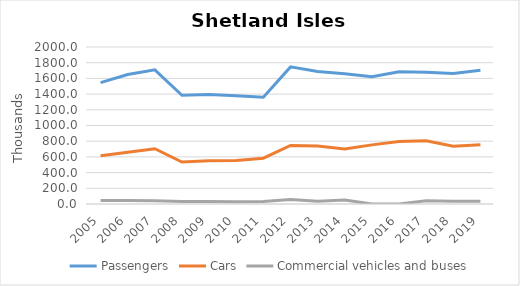
| Category | Passengers | Cars | Commercial vehicles and buses |
|---|---|---|---|
| 2005.0 | 1546.723 | 614.5 | 44.8 |
| 2006.0 | 1649.078 | 660.424 | 43.61 |
| 2007.0 | 1708.572 | 703.868 | 41.382 |
| 2008.0 | 1384.764 | 534.804 | 31.112 |
| 2009.0 | 1393.5 | 550.2 | 31.2 |
| 2010.0 | 1377.8 | 555.4 | 30 |
| 2011.0 | 1359.1 | 583.6 | 30.76 |
| 2012.0 | 1746.6 | 746.2 | 57 |
| 2013.0 | 1687.307 | 737.842 | 35.366 |
| 2014.0 | 1658.493 | 701 | 50.796 |
| 2015.0 | 1621.744 | 753.116 | 0.172 |
| 2016.0 | 1683.26 | 794.88 | 0.198 |
| 2017.0 | 1679.902 | 806.337 | 41.229 |
| 2018.0 | 1662.092 | 736.979 | 35.687 |
| 2019.0 | 1702.441 | 755.526 | 35.064 |